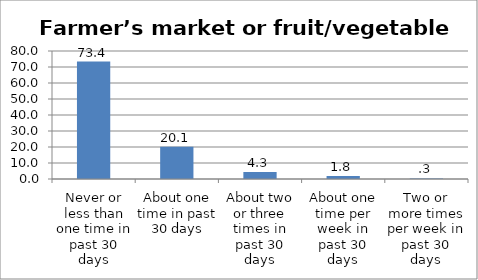
| Category | Series 0 |
|---|---|
| Never or less than one time in past 30 days | 73.41 |
| About one time in past 30 days | 20.131 |
| About two or three times in past 30 days | 4.316 |
| About one time per week in past 30 days | 1.824 |
| Two or more times per week in past 30 days | 0.32 |